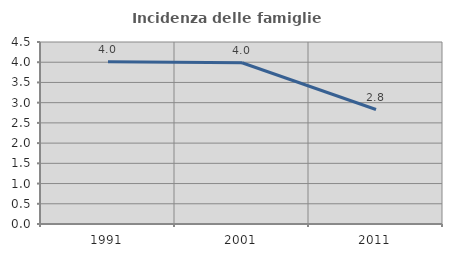
| Category | Incidenza delle famiglie numerose |
|---|---|
| 1991.0 | 4.015 |
| 2001.0 | 3.987 |
| 2011.0 | 2.83 |